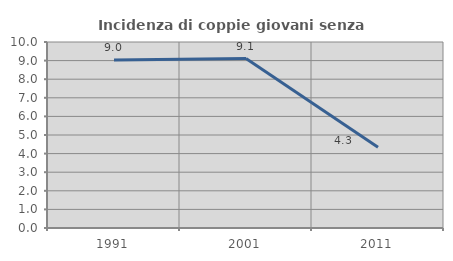
| Category | Incidenza di coppie giovani senza figli |
|---|---|
| 1991.0 | 9.037 |
| 2001.0 | 9.107 |
| 2011.0 | 4.348 |